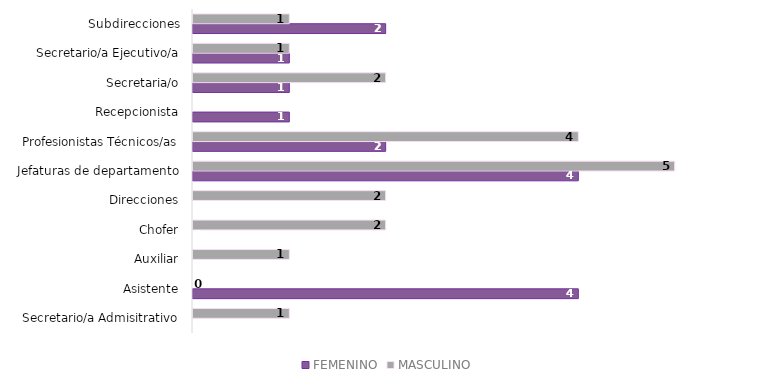
| Category | FEMENINO | MASCULINO |
|---|---|---|
| Secretario/a Admisitrativo | 0 | 1 |
| Asistente | 4 | 0 |
| Auxiliar | 0 | 1 |
| Chofer | 0 | 2 |
| Direcciones | 0 | 2 |
| Jefaturas de departamento | 4 | 5 |
| Profesionistas Técnicos/as | 2 | 4 |
| Recepcionista | 1 | 0 |
| Secretaria/o | 1 | 2 |
| Secretario/a Ejecutivo/a | 1 | 1 |
| Subdirecciones | 2 | 1 |